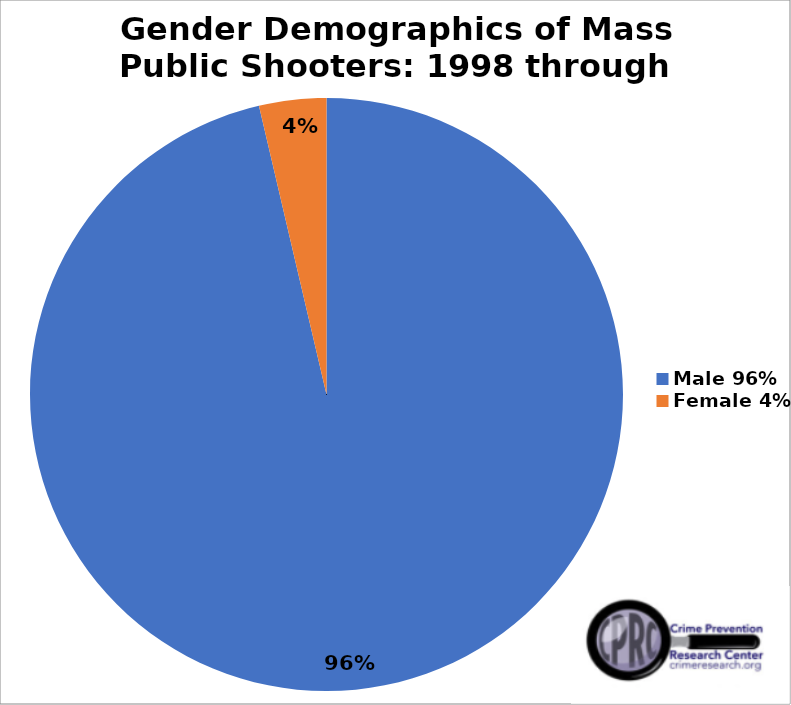
| Category | Series 0 |
|---|---|
| Male 96% | 0.963 |
| Female 4% | 0.037 |